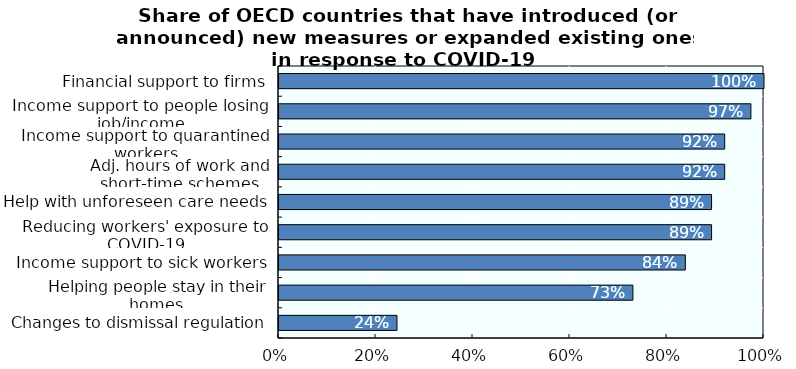
| Category | Series 0 |
|---|---|
| Financial support to firms | 1 |
| Income support to people losing job/income | 0.973 |
| Income support to quarantined workers | 0.919 |
| Adj. hours of work and short-time schemes | 0.919 |
| Help with unforeseen care needs | 0.892 |
| Reducing workers' exposure to COVID-19 | 0.892 |
| Income support to sick workers | 0.838 |
| Helping people stay in their homes  | 0.73 |
| Changes to dismissal regulation | 0.243 |